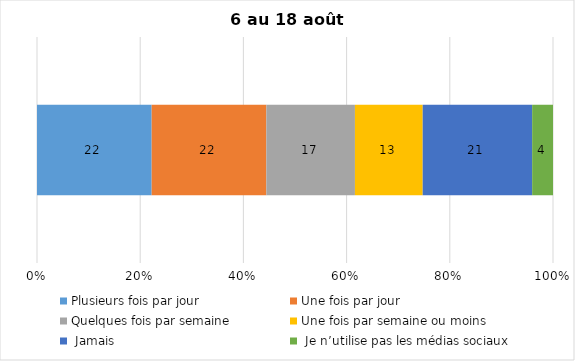
| Category | Plusieurs fois par jour | Une fois par jour | Quelques fois par semaine   | Une fois par semaine ou moins   |  Jamais   |  Je n’utilise pas les médias sociaux |
|---|---|---|---|---|---|---|
| 0 | 22 | 22 | 17 | 13 | 21 | 4 |